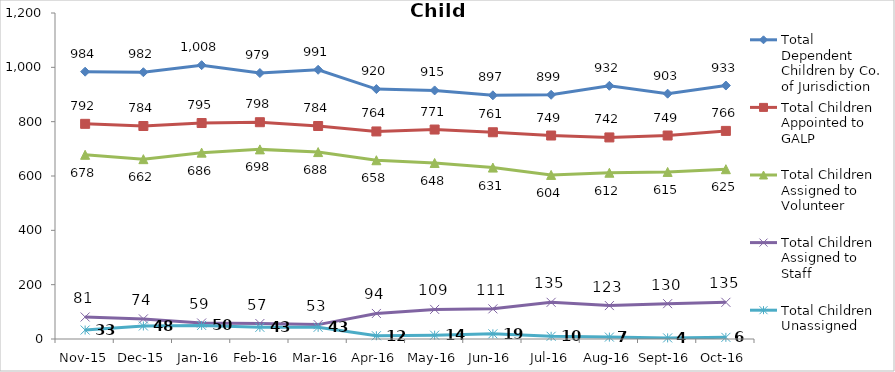
| Category | Total Dependent Children by Co. of Jurisdiction | Total Children Appointed to GALP | Total Children Assigned to Volunteer | Total Children Assigned to Staff | Total Children Unassigned |
|---|---|---|---|---|---|
| Nov-15 | 984 | 792 | 678 | 81 | 33 |
| Dec-15 | 982 | 784 | 662 | 74 | 48 |
| Jan-16 | 1008 | 795 | 686 | 59 | 50 |
| Feb-16 | 979 | 798 | 698 | 57 | 43 |
| Mar-16 | 991 | 784 | 688 | 53 | 43 |
| Apr-16 | 920 | 764 | 658 | 94 | 12 |
| May-16 | 915 | 771 | 648 | 109 | 14 |
| Jun-16 | 897 | 761 | 631 | 111 | 19 |
| Jul-16 | 899 | 749 | 604 | 135 | 10 |
| Aug-16 | 932 | 742 | 612 | 123 | 7 |
| Sep-16 | 903 | 749 | 615 | 130 | 4 |
| Oct-16 | 933 | 766 | 625 | 135 | 6 |